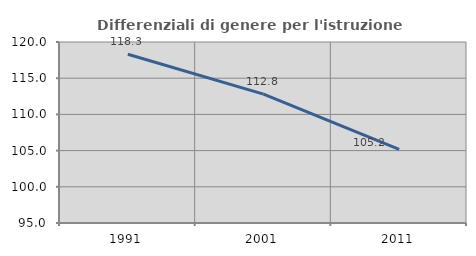
| Category | Differenziali di genere per l'istruzione superiore |
|---|---|
| 1991.0 | 118.306 |
| 2001.0 | 112.796 |
| 2011.0 | 105.163 |